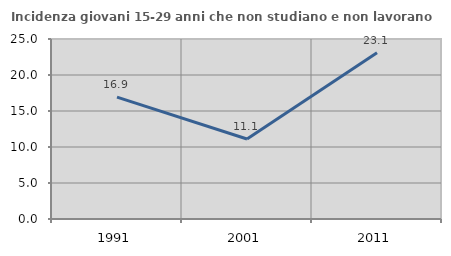
| Category | Incidenza giovani 15-29 anni che non studiano e non lavorano  |
|---|---|
| 1991.0 | 16.923 |
| 2001.0 | 11.111 |
| 2011.0 | 23.077 |